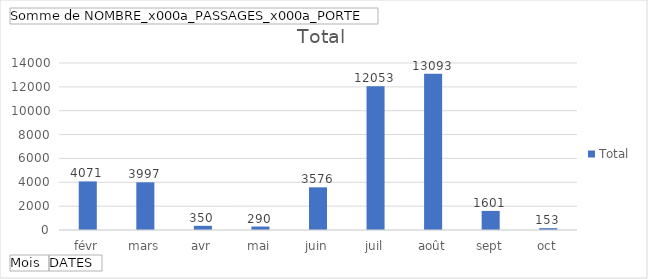
| Category | Total |
|---|---|
| févr | 4071 |
| mars | 3997 |
| avr | 350 |
| mai | 290 |
| juin | 3576 |
| juil | 12053 |
| août | 13093 |
| sept | 1601 |
| oct | 153 |